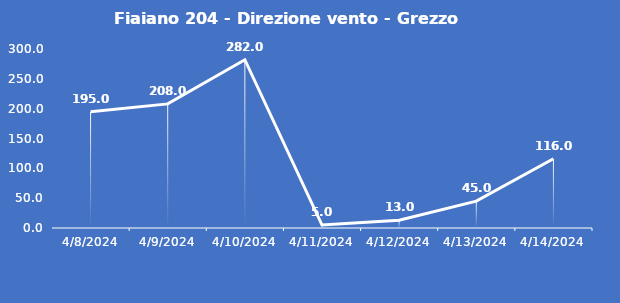
| Category | Fiaiano 204 - Direzione vento - Grezzo (°N) |
|---|---|
| 4/8/24 | 195 |
| 4/9/24 | 208 |
| 4/10/24 | 282 |
| 4/11/24 | 5 |
| 4/12/24 | 13 |
| 4/13/24 | 45 |
| 4/14/24 | 116 |